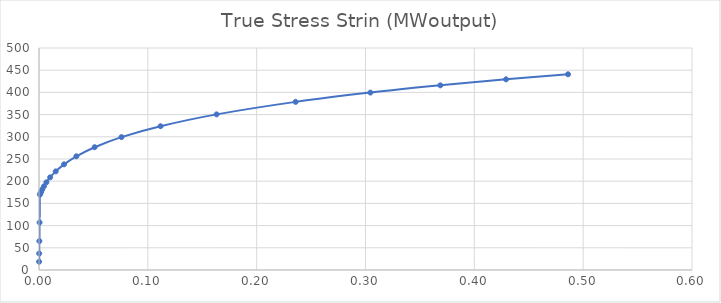
| Category | Series 0 |
|---|---|
| 8.99959502429071e-05 | 18.609 |
| 0.000179983801943807 | 37.217 |
| 0.000314950397916229 | 65.126 |
| 0.000517366143053604 | 106.982 |
| 0.000820912958736214 | 169.752 |
| 0.00127606548202025 | 172.494 |
| 0.00195839109970242 | 176.252 |
| 0.00298102233448872 | 181.553 |
| 0.00451300107383731 | 188.51 |
| 0.00680658256963524 | 197.409 |
| 0.0102371214079935 | 208.672 |
| 0.0153610132102306 | 222.114 |
| 0.0229978113721286 | 237.994 |
| 0.0343449033807882 | 256.127 |
| 0.0511277156801529 | 276.566 |
| 0.0757852575808854 | 299.269 |
| 0.111667484848671 | 323.832 |
| 0.163187156184584 | 350.497 |
| 0.235807819867008 | 378.672 |
| 0.304488303267768 | 399.595 |
| 0.368753404755717 | 415.904 |
| 0.429136711841463 | 429.439 |
| 0.486080574800857 | 440.777 |